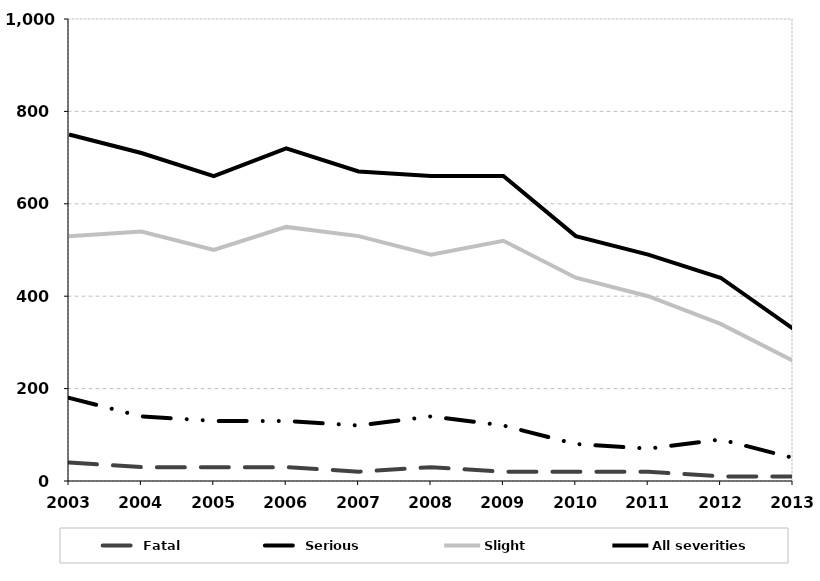
| Category | Fatal | Serious | Slight | All severities |
|---|---|---|---|---|
| 2003.0 | 40 | 180 | 530 | 750 |
| 2004.0 | 30 | 140 | 540 | 710 |
| 2005.0 | 30 | 130 | 500 | 660 |
| 2006.0 | 30 | 130 | 550 | 720 |
| 2007.0 | 20 | 120 | 530 | 670 |
| 2008.0 | 30 | 140 | 490 | 660 |
| 2009.0 | 20 | 120 | 520 | 660 |
| 2010.0 | 20 | 80 | 440 | 530 |
| 2011.0 | 20 | 70 | 400 | 490 |
| 2012.0 | 10 | 90 | 340 | 440 |
| 2013.0 | 10 | 50 | 260 | 330 |